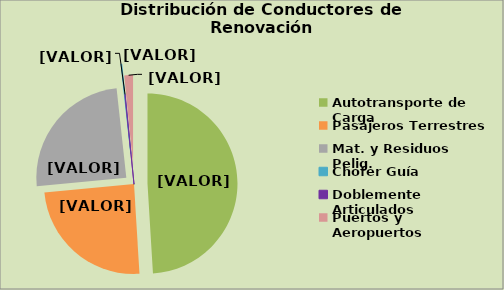
| Category | Series 0 |
|---|---|
| Autotransporte de Carga | 49.032 |
| Pasajeros Terrestres | 24.477 |
| Mat. y Residuos Pelig. | 24.761 |
| Chofer Guía | 0.123 |
| Doblemente Articulados | 0.04 |
| Puertos y Aeropuertos | 1.567 |